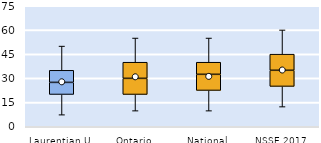
| Category | 25th | 50th | 75th |
|---|---|---|---|
| Laurentian U | 20 | 7.5 | 7.5 |
| Ontario | 20 | 10 | 10 |
| National | 22.5 | 10 | 7.5 |
| NSSE 2017 | 25 | 10 | 10 |